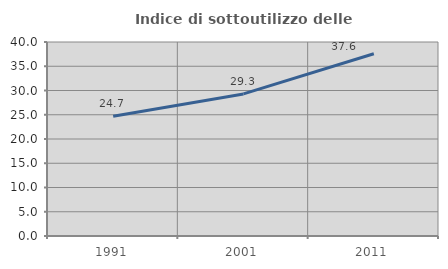
| Category | Indice di sottoutilizzo delle abitazioni  |
|---|---|
| 1991.0 | 24.698 |
| 2001.0 | 29.29 |
| 2011.0 | 37.567 |